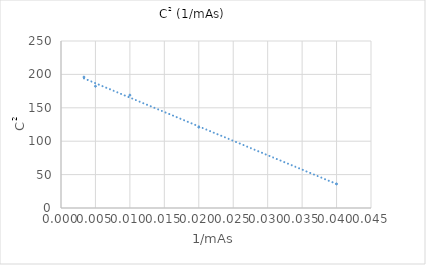
| Category | Series 0 |
|---|---|
| 0.04 | 36 |
| 0.02 | 121 |
| 0.01 | 169 |
| 0.005 | 182.25 |
| 0.0033333333333333335 | 196 |